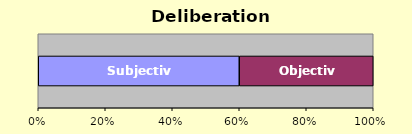
| Category | Subjective | Objective |
|---|---|---|
| 0 | 3 | 2 |